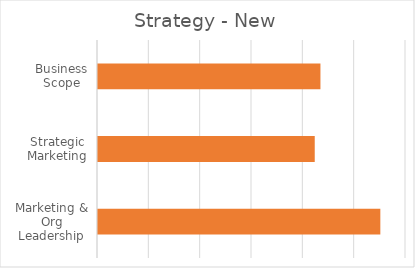
| Category | New Scope |
|---|---|
| Marketing & Org Leadership | 2.75 |
| Strategic Marketing | 2.111 |
| Business Scope | 2.167 |